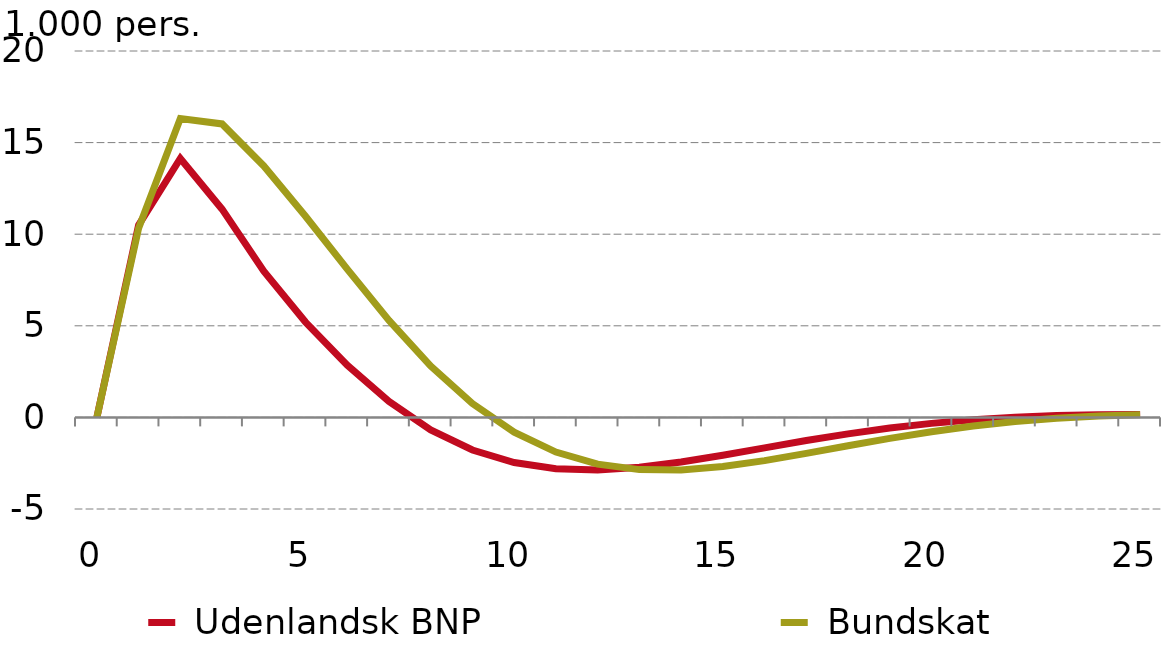
| Category |  Udenlandsk BNP |  Bundskat |
|---|---|---|
| 0.0 | 0 | 0 |
| nan | 10.5 | 10.328 |
| nan | 14.137 | 16.312 |
| nan | 11.367 | 16.019 |
| nan | 7.981 | 13.726 |
| 5.0 | 5.204 | 10.981 |
| nan | 2.849 | 8.095 |
| nan | 0.868 | 5.297 |
| nan | -0.679 | 2.806 |
| nan | -1.778 | 0.756 |
| 10.0 | -2.466 | -0.805 |
| nan | -2.806 | -1.891 |
| nan | -2.866 | -2.55 |
| nan | -2.719 | -2.851 |
| nan | -2.432 | -2.869 |
| 15.0 | -2.063 | -2.681 |
| nan | -1.661 | -2.36 |
| nan | -1.264 | -1.965 |
| nan | -0.899 | -1.548 |
| nan | -0.584 | -1.144 |
| 20.0 | -0.326 | -0.781 |
| nan | -0.129 | -0.473 |
| nan | 0.011 | -0.228 |
| nan | 0.101 | -0.046 |
| nan | 0.149 | 0.078 |
| 25.0 | 0.163 | 0.151 |